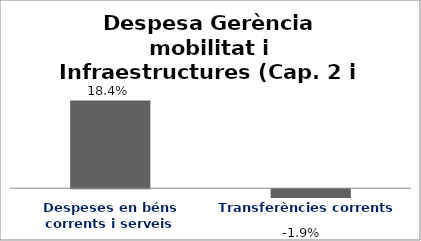
| Category | Series 0 |
|---|---|
| Despeses en béns corrents i serveis | 0.184 |
| Transferències corrents | -0.019 |